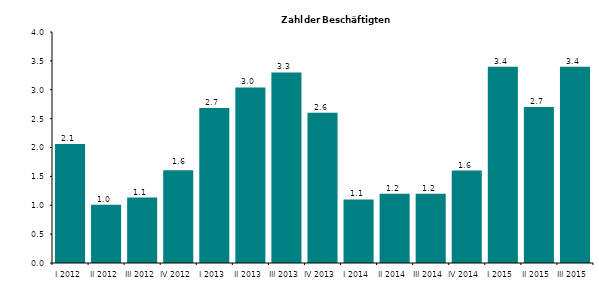
| Category | Series 0 |
|---|---|
| I 2012 | 2.063 |
| II 2012 | 1.009 |
| III 2012 | 1.132 |
| IV 2012 | 1.607 |
| I 2013 | 2.682 |
| II 2013 | 3.039 |
| III 2013 | 3.3 |
| IV 2013 | 2.6 |
| I 2014 | 1.1 |
| II 2014 | 1.2 |
| III 2014 | 1.2 |
| IV 2014 | 1.6 |
| I 2015 | 3.4 |
| II 2015 | 2.7 |
| III 2015 | 3.4 |